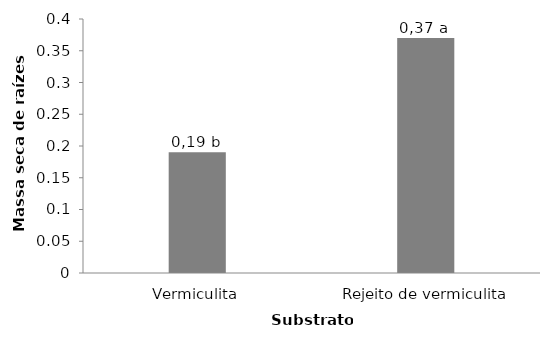
| Category | Series 0 |
|---|---|
| Vermiculita | 0.19 |
| Rejeito de vermiculita | 0.37 |